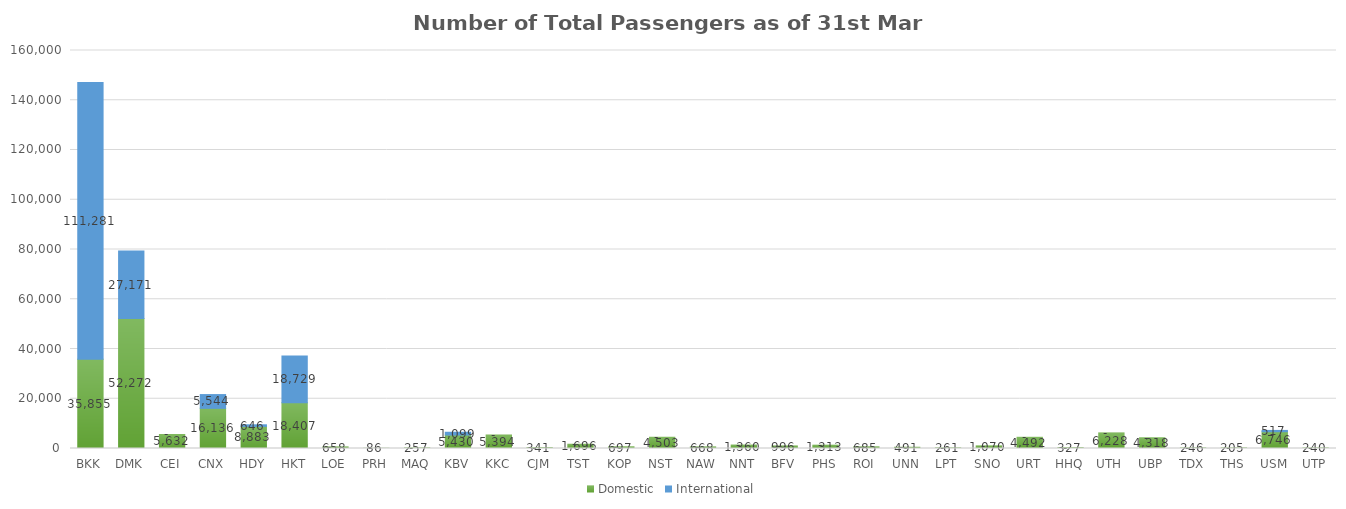
| Category | Domestic | International |
|---|---|---|
| BKK | 35855 | 111281 |
| DMK | 52272 | 27171 |
| CEI | 5632 | 0 |
| CNX | 16136 | 5544 |
| HDY | 8883 | 646 |
| HKT | 18407 | 18729 |
| LOE | 658 | 0 |
| PRH | 86 | 0 |
| MAQ | 257 | 0 |
| KBV | 5430 | 1099 |
| KKC | 5394 | 0 |
| CJM | 341 | 0 |
| TST | 1696 | 0 |
| KOP | 697 | 0 |
| NST | 4503 | 0 |
| NAW | 668 | 0 |
| NNT | 1360 | 0 |
| BFV | 996 | 0 |
| PHS | 1313 | 0 |
| ROI | 685 | 0 |
| UNN | 491 | 0 |
| LPT | 261 | 0 |
| SNO | 1070 | 0 |
| URT | 4492 | 0 |
| HHQ | 327 | 0 |
| UTH | 6228 | 0 |
| UBP | 4318 | 0 |
| TDX | 246 | 0 |
| THS | 205 | 0 |
| USM | 6746 | 517 |
| UTP | 240 | 0 |